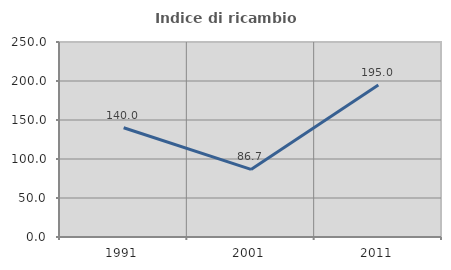
| Category | Indice di ricambio occupazionale  |
|---|---|
| 1991.0 | 140 |
| 2001.0 | 86.667 |
| 2011.0 | 195 |